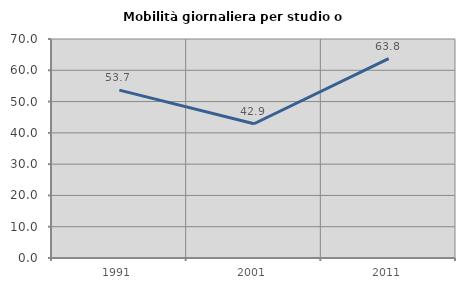
| Category | Mobilità giornaliera per studio o lavoro |
|---|---|
| 1991.0 | 53.651 |
| 2001.0 | 42.903 |
| 2011.0 | 63.75 |